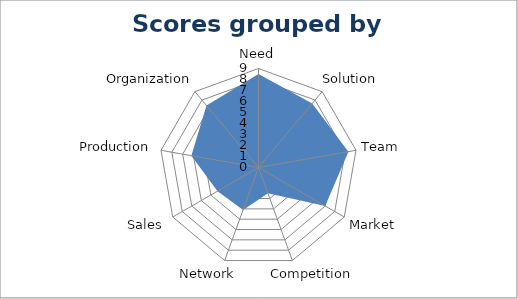
| Category | Series 0 |
|---|---|
| Need | 8.5 |
| Solution | 7.6 |
| Team | 8.3 |
| Market | 7 |
| Competition | 2.5 |
| Network | 4.1 |
| Sales | 4.3 |
| Production | 6.2 |
| Organization | 7.35 |